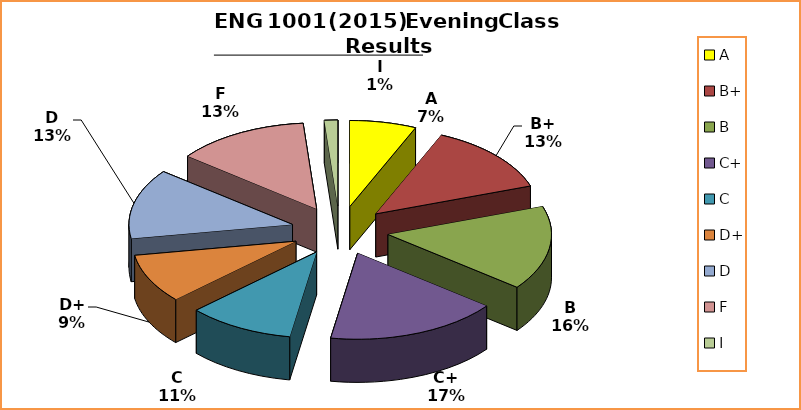
| Category | Series 0 |
|---|---|
| A | 5 |
| B+ | 10 |
| B | 12 |
| C+ | 13 |
| C | 8 |
| D+ | 7 |
| D | 10 |
| F | 10 |
| I | 1 |